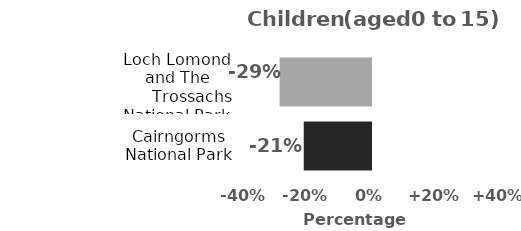
| Category | Children (aged 0 to 15) |
|---|---|
| Cairngorms National Park | -21.353 |
| Loch Lomond and The
      Trossachs National Park | -29.006 |